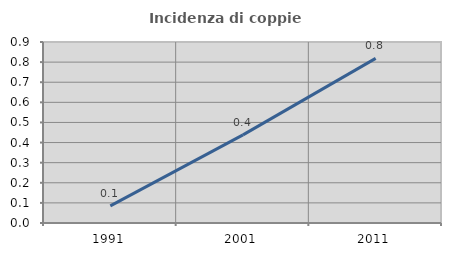
| Category | Incidenza di coppie miste |
|---|---|
| 1991.0 | 0.085 |
| 2001.0 | 0.438 |
| 2011.0 | 0.819 |